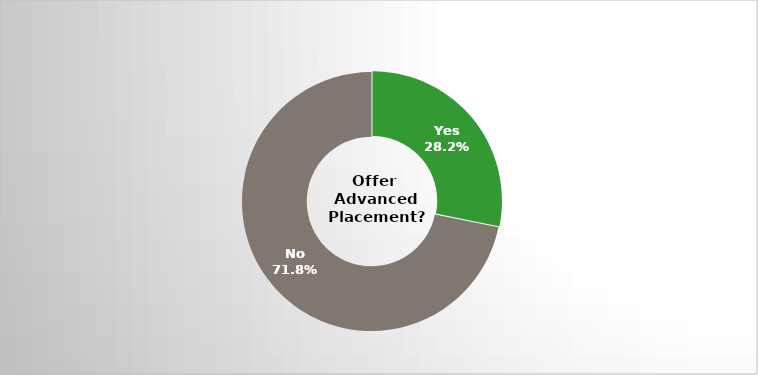
| Category | Series 0 |
|---|---|
| Yes | 0.282 |
| No | 0.718 |